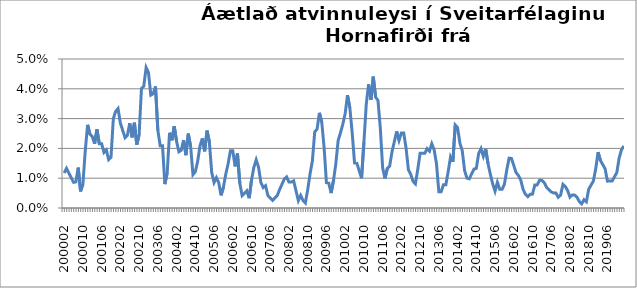
| Category | Series 0 |
|---|---|
| 200002 | 0.012 |
| 200003 | 0.013 |
| 200004 | 0.012 |
| 200005 | 0.01 |
| 200006 | 0.009 |
| 200007 | 0.009 |
| 200008 | 0.014 |
| 200009 | 0.006 |
| 200010 | 0.008 |
| 200011 | 0.019 |
| 200012 | 0.028 |
| 200101 | 0.025 |
| 200102 | 0.024 |
| 200103 | 0.022 |
| 200104 | 0.026 |
| 200105 | 0.022 |
| 200106 | 0.022 |
| 200107 | 0.019 |
| 200108 | 0.019 |
| 200109 | 0.016 |
| 200110 | 0.017 |
| 200111 | 0.03 |
| 200112 | 0.032 |
| 200201 | 0.033 |
| 200202 | 0.028 |
| 200203 | 0.026 |
| 200204 | 0.024 |
| 200205 | 0.024 |
| 200206 | 0.028 |
| 200207 | 0.024 |
| 200208 | 0.029 |
| 200209 | 0.021 |
| 200210 | 0.025 |
| 200211 | 0.04 |
| 200212 | 0.041 |
| 200301 | 0.047 |
| 200302 | 0.045 |
| 200303 | 0.038 |
| 200304 | 0.038 |
| 200305 | 0.041 |
| 200306 | 0.026 |
| 200307 | 0.021 |
| 200308 | 0.021 |
| 200309 | 0.008 |
| 200310 | 0.012 |
| 200311 | 0.025 |
| 200312 | 0.023 |
| 200401 | 0.027 |
| 200402 | 0.022 |
| 200403 | 0.019 |
| 200404 | 0.019 |
| 200405 | 0.023 |
| 200406 | 0.018 |
| 200407 | 0.025 |
| 200408 | 0.021 |
| 200409 | 0.011 |
| 200410 | 0.012 |
| 200411 | 0.016 |
| 200412 | 0.021 |
| 200501 | 0.023 |
| 200502 | 0.019 |
| 200503 | 0.026 |
| 200504 | 0.022 |
| 200505 | 0.012 |
| 200506 | 0.009 |
| 200507 | 0.01 |
| 200508 | 0.008 |
| 200509 | 0.004 |
| 200510 | 0.007 |
| 200511 | 0.011 |
| 200512 | 0.015 |
| 200601 | 0.019 |
| 200602 | 0.019 |
| 200603 | 0.014 |
| 200604 | 0.018 |
| 200605 | 0.008 |
| 200606 | 0.004 |
| 200607 | 0.005 |
| 200608 | 0.006 |
| 200609 | 0.003 |
| 200610 | 0.009 |
| 200611 | 0.014 |
| 200612 | 0.016 |
| 200701 | 0.014 |
| 200702 | 0.009 |
| 200703 | 0.007 |
| 200704 | 0.007 |
| 200705 | 0.004 |
| 200706 | 0.003 |
| 200707 | 0.003 |
| 200708 | 0.003 |
| 200709 | 0.004 |
| 200710 | 0.006 |
| 200711 | 0.008 |
| 200712 | 0.01 |
| 200801 | 0.01 |
| 200802 | 0.009 |
| 200803 | 0.009 |
| 200804 | 0.009 |
| 200805 | 0.006 |
| 200806 | 0.002 |
| 200807 | 0.004 |
| 200808 | 0.003 |
| 200809 | 0.002 |
| 200810 | 0.006 |
| 200811 | 0.011 |
| 200812 | 0.016 |
| 200901 | 0.026 |
| 200902 | 0.026 |
| 200903 | 0.032 |
| 200904 | 0.029 |
| 200905 | 0.02 |
| 200906 | 0.008 |
| 200907 | 0.008 |
| 200908 | 0.005 |
| 200909 | 0.009 |
| 200910 | 0.015 |
| 200911 | 0.023 |
| 200912 | 0.025 |
| 201001 | 0.028 |
| 201002 | 0.032 |
| 201003 | 0.038 |
| 201004 | 0.034 |
| 201005 | 0.025 |
| 201006 | 0.015 |
| 201007 | 0.015 |
| 201008 | 0.012 |
| 201009 | 0.01 |
| 201010 | 0.022 |
| 201011 | 0.035 |
| 201012 | 0.042 |
| 201101 | 0.036 |
| 201102 | 0.044 |
| 201103 | 0.037 |
| 201104 | 0.036 |
| 201105 | 0.027 |
| 201106 | 0.013 |
| 201107 | 0.01 |
| 201108 | 0.013 |
| 201109 | 0.014 |
| 201110 | 0.019 |
| 201111 | 0.022 |
| 201112 | 0.026 |
| 201201 | 0.023 |
| 201202 | 0.025 |
| 201203 | 0.025 |
| 201204 | 0.02 |
| 201205 | 0.013 |
| 201206 | 0.011 |
| 201207 | 0.009 |
| 201208 | 0.008 |
| 201209 | 0.013 |
| 201210 | 0.018 |
| 201211 | 0.018 |
| 201212 | 0.018 |
| 201301 | 0.02 |
| 201302 | 0.019 |
| 201303 | 0.022 |
| 201304 | 0.02 |
| 201305 | 0.015 |
| 201306 | 0.005 |
| 201307 | 0.005 |
| 201308 | 0.008 |
| 201309 | 0.008 |
| 201310 | 0.012 |
| 201311 | 0.017 |
| 201312 | 0.016 |
| 201401* | 0.028 |
| 201402 | 0.027 |
| 201403 | 0.022 |
| 201404 | 0.019 |
| 201405 | 0.013 |
| 201406 | 0.01 |
| 201407 | 0.01 |
| 201408 | 0.011 |
| 201409 | 0.013 |
| 201410 | 0.013 |
| 201411 | 0.018 |
| 201412 | 0.02 |
| 201501 | 0.017 |
| 201502 | 0.02 |
| 201503 | 0.015 |
| 201504 | 0.011 |
| 201505 | 0.008 |
| 201506 | 0.006 |
| 201507 | 0.009 |
| 201508 | 0.006 |
| 201509 | 0.006 |
| 201510 | 0.008 |
| 201511 | 0.013 |
| 201512 | 0.017 |
| 201601 | 0.017 |
| 201602 | 0.014 |
| 201603 | 0.012 |
| 201604 | 0.011 |
| 201605 | 0.009 |
| 201606 | 0.006 |
| 201607 | 0.005 |
| 201608 | 0.004 |
| 201609 | 0.005 |
| 201610 | 0.005 |
| 201611 | 0.008 |
| 201612 | 0.008 |
| 201701 | 0.009 |
| 201702 | 0.009 |
| 201703 | 0.009 |
| 201704 | 0.007 |
| 201705 | 0.006 |
| 201706 | 0.005 |
| 201707 | 0.005 |
| 201708 | 0.005 |
| 201709 | 0.004 |
| 201710 | 0.004 |
| 201711 | 0.008 |
| 201712 | 0.007 |
| 201801 | 0.006 |
| 201802 | 0.004 |
| 201803 | 0.004 |
| 201804 | 0.004 |
| 201805 | 0.004 |
| 201806 | 0.002 |
| 201807 | 0.001 |
| 201808 | 0.003 |
| 201809 | 0.002 |
| 201810 | 0.006 |
| 201811 | 0.008 |
| 201812 | 0.009 |
| 201901 | 0.013 |
| 201902 | 0.019 |
| 201903 | 0.016 |
| 201904 | 0.015 |
| 201905 | 0.013 |
| 201906 | 0.009 |
| 201907 | 0.009 |
| 201908 | 0.009 |
| 201909 | 0.01 |
| 201910 | 0.012 |
| 201911 | 0.017 |
| 201912 | 0.02 |
| 202001 | 0.021 |